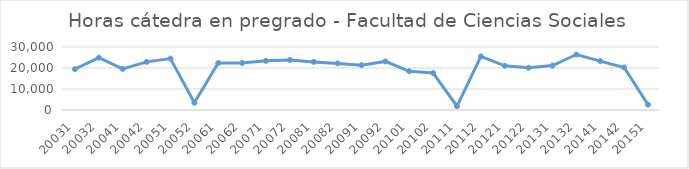
| Category | Total horas |
|---|---|
| 20031 | 19466 |
| 20032 | 24897 |
| 20041 | 19560 |
| 20042 | 22912 |
| 20051 | 24486 |
| 20052 | 3461 |
| 20061 | 22361 |
| 20062 | 22386 |
| 20071 | 23411 |
| 20072 | 23820 |
| 20081 | 22905 |
| 20082 | 22201 |
| 20091 | 21345 |
| 20092 | 23142 |
| 20101 | 18444 |
| 20102 | 17606 |
| 20111 | 1808 |
| 20112 | 25531 |
| 20121 | 21040 |
| 20122 | 20112 |
| 20131 | 21160 |
| 20132 | 26424 |
| 20141 | 23298 |
| 20142 | 20260 |
| 20151 | 2528 |